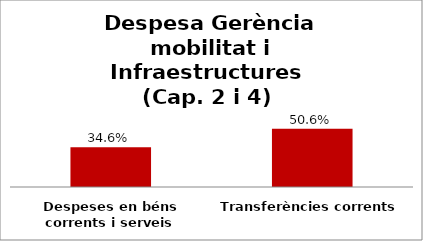
| Category | Series 0 |
|---|---|
| Despeses en béns corrents i serveis | 0.346 |
| Transferències corrents | 0.506 |